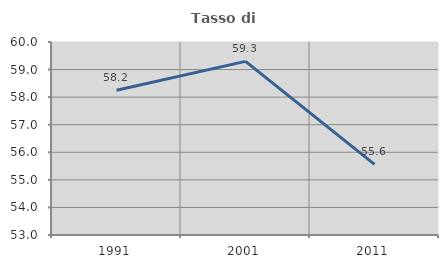
| Category | Tasso di occupazione   |
|---|---|
| 1991.0 | 58.247 |
| 2001.0 | 59.298 |
| 2011.0 | 55.563 |